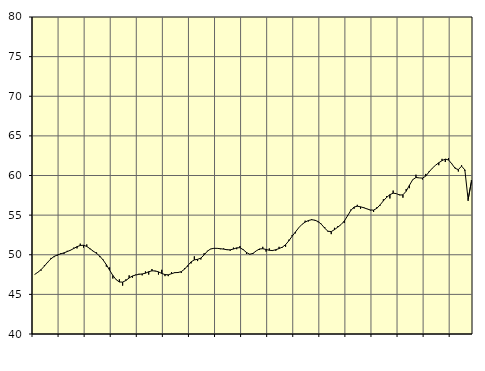
| Category | Piggar | Samtliga anställda (inkl. anställda utomlands) |
|---|---|---|
| nan | 47.5 | 47.51 |
| 87.0 | 47.8 | 47.79 |
| 87.0 | 48 | 48.13 |
| 87.0 | 48.7 | 48.57 |
| nan | 49 | 49.06 |
| 88.0 | 49.6 | 49.48 |
| 88.0 | 49.7 | 49.79 |
| 88.0 | 49.9 | 49.98 |
| nan | 50.2 | 50.11 |
| 89.0 | 50.1 | 50.24 |
| 89.0 | 50.5 | 50.4 |
| 89.0 | 50.6 | 50.57 |
| nan | 50.9 | 50.79 |
| 90.0 | 50.8 | 51.02 |
| 90.0 | 51.4 | 51.17 |
| 90.0 | 50.9 | 51.2 |
| nan | 51.3 | 51.05 |
| 91.0 | 50.7 | 50.76 |
| 91.0 | 50.4 | 50.45 |
| 91.0 | 50.3 | 50.17 |
| nan | 49.7 | 49.82 |
| 92.0 | 49.4 | 49.34 |
| 92.0 | 48.5 | 48.75 |
| 92.0 | 48.4 | 48.06 |
| nan | 47 | 47.39 |
| 93.0 | 46.9 | 46.86 |
| 93.0 | 46.9 | 46.56 |
| 93.0 | 46.1 | 46.55 |
| nan | 46.9 | 46.75 |
| 94.0 | 47.4 | 47.07 |
| 94.0 | 47.1 | 47.32 |
| 94.0 | 47.5 | 47.44 |
| nan | 47.6 | 47.53 |
| 95.0 | 47.4 | 47.58 |
| 95.0 | 47.9 | 47.67 |
| 95.0 | 47.5 | 47.86 |
| nan | 48.2 | 47.97 |
| 96.0 | 47.9 | 47.96 |
| 96.0 | 47.5 | 47.84 |
| 96.0 | 48.1 | 47.64 |
| nan | 47.3 | 47.5 |
| 97.0 | 47.3 | 47.47 |
| 97.0 | 47.8 | 47.61 |
| 97.0 | 47.8 | 47.74 |
| nan | 47.7 | 47.76 |
| 98.0 | 47.7 | 47.87 |
| 98.0 | 48.3 | 48.18 |
| 98.0 | 48.5 | 48.64 |
| nan | 48.9 | 49.1 |
| 99.0 | 49.8 | 49.35 |
| 99.0 | 49.2 | 49.42 |
| 99.0 | 49.4 | 49.58 |
| nan | 50.2 | 49.97 |
| 0.0 | 50.5 | 50.45 |
| 0.0 | 50.7 | 50.73 |
| 0.0 | 50.8 | 50.81 |
| nan | 50.8 | 50.81 |
| 1.0 | 50.7 | 50.76 |
| 1.0 | 50.8 | 50.71 |
| 1.0 | 50.7 | 50.63 |
| nan | 50.5 | 50.62 |
| 2.0 | 50.9 | 50.72 |
| 2.0 | 50.7 | 50.87 |
| 2.0 | 51.1 | 50.89 |
| nan | 50.7 | 50.64 |
| 3.0 | 50.1 | 50.29 |
| 3.0 | 50.1 | 50.06 |
| 3.0 | 50.1 | 50.17 |
| nan | 50.5 | 50.49 |
| 4.0 | 50.6 | 50.73 |
| 4.0 | 51 | 50.76 |
| 4.0 | 50.4 | 50.67 |
| nan | 50.8 | 50.56 |
| 5.0 | 50.6 | 50.53 |
| 5.0 | 50.5 | 50.64 |
| 5.0 | 51 | 50.78 |
| nan | 50.9 | 50.96 |
| 6.0 | 51 | 51.27 |
| 6.0 | 51.9 | 51.76 |
| 6.0 | 52.5 | 52.33 |
| nan | 52.7 | 52.86 |
| 7.0 | 53.4 | 53.39 |
| 7.0 | 53.8 | 53.82 |
| 7.0 | 54.3 | 54.12 |
| nan | 54.2 | 54.32 |
| 8.0 | 54.5 | 54.42 |
| 8.0 | 54.3 | 54.36 |
| 8.0 | 54.1 | 54.18 |
| nan | 53.9 | 53.84 |
| 9.0 | 53.5 | 53.35 |
| 9.0 | 52.9 | 52.97 |
| 9.0 | 52.6 | 52.92 |
| nan | 53.4 | 53.17 |
| 10.0 | 53.6 | 53.48 |
| 10.0 | 53.8 | 53.8 |
| 10.0 | 54 | 54.25 |
| nan | 55 | 54.9 |
| 11.0 | 55.7 | 55.58 |
| 11.0 | 55.8 | 56.02 |
| 11.0 | 56.3 | 56.12 |
| nan | 55.8 | 56.05 |
| 12.0 | 56 | 55.93 |
| 12.0 | 55.8 | 55.78 |
| 12.0 | 55.6 | 55.65 |
| nan | 55.4 | 55.63 |
| 13.0 | 56 | 55.86 |
| 13.0 | 56.2 | 56.3 |
| 13.0 | 57 | 56.8 |
| nan | 57.4 | 57.24 |
| 14.0 | 57.1 | 57.58 |
| 14.0 | 58.1 | 57.77 |
| 14.0 | 57.7 | 57.71 |
| nan | 57.6 | 57.53 |
| 15.0 | 57.2 | 57.56 |
| 15.0 | 58.3 | 58.02 |
| 15.0 | 58.4 | 58.77 |
| nan | 59.5 | 59.47 |
| 16.0 | 60.1 | 59.75 |
| 16.0 | 59.7 | 59.7 |
| 16.0 | 59.5 | 59.67 |
| nan | 60.2 | 59.92 |
| 17.0 | 60.5 | 60.44 |
| 17.0 | 60.9 | 60.92 |
| 17.0 | 61.3 | 61.29 |
| nan | 61.3 | 61.61 |
| 18.0 | 62.1 | 61.88 |
| 18.0 | 61.7 | 62.07 |
| 18.0 | 62.2 | 61.96 |
| nan | 61.5 | 61.47 |
| 19.0 | 61 | 60.91 |
| 19.0 | 60.5 | 60.74 |
| 19.0 | 61.3 | 61.18 |
| nan | 60.6 | 60.71 |
| 20.0 | 56.8 | 56.96 |
| 20.0 | 59.4 | 59.21 |